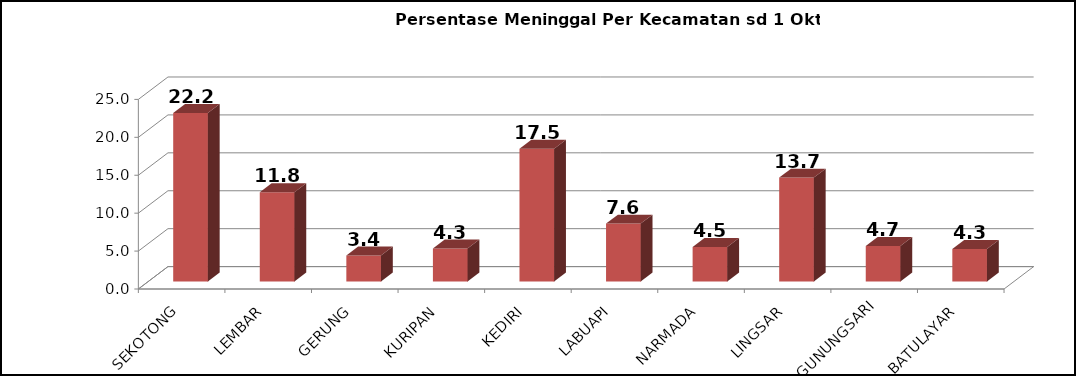
| Category | Series 0 |
|---|---|
| SEKOTONG | 22.222 |
| LEMBAR | 11.765 |
| GERUNG | 3.419 |
| KURIPAN | 4.348 |
| KEDIRI | 17.5 |
| LABUAPI | 7.634 |
| NARMADA | 4.545 |
| LINGSAR | 13.699 |
| GUNUNGSARI | 4.673 |
| BATULAYAR | 4.286 |